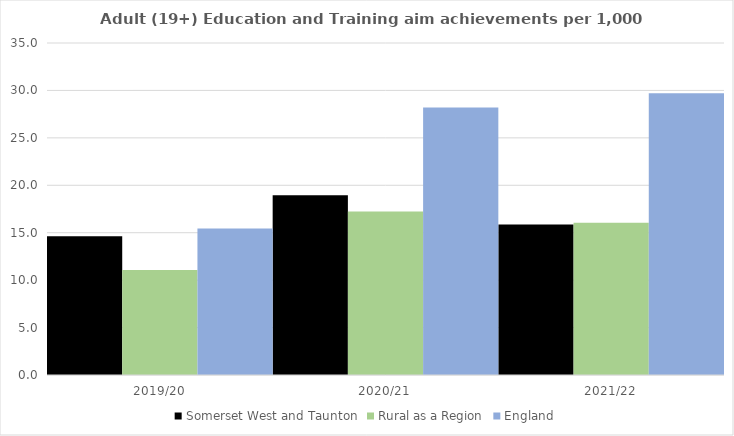
| Category | Somerset West and Taunton | Rural as a Region | England |
|---|---|---|---|
| 2019/20 | 14.615 | 11.081 | 15.446 |
| 2020/21 | 18.938 | 17.224 | 28.211 |
| 2021/22 | 15.861 | 16.063 | 29.711 |